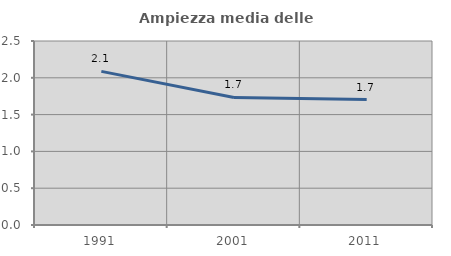
| Category | Ampiezza media delle famiglie |
|---|---|
| 1991.0 | 2.088 |
| 2001.0 | 1.733 |
| 2011.0 | 1.705 |